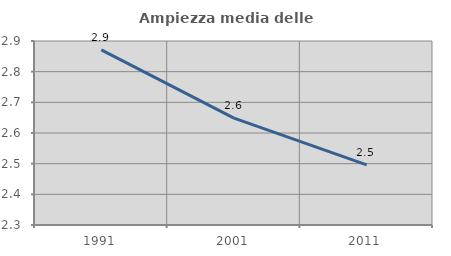
| Category | Ampiezza media delle famiglie |
|---|---|
| 1991.0 | 2.871 |
| 2001.0 | 2.649 |
| 2011.0 | 2.496 |